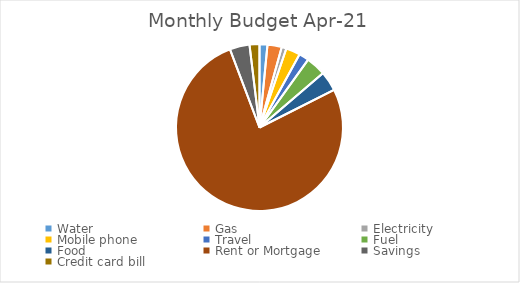
| Category | Monthly Budget |
|---|---|
| Water | 15 |
| Gas | 10 |
| Electricity | 35 |
| Mobile phone | 38 |
| Travel | 35 |
| Fuel | 58 |
| Food | 52 |
| Rent or Mortgage | 1000 |
| Savings | 55 |
| Credit card bill | 35 |